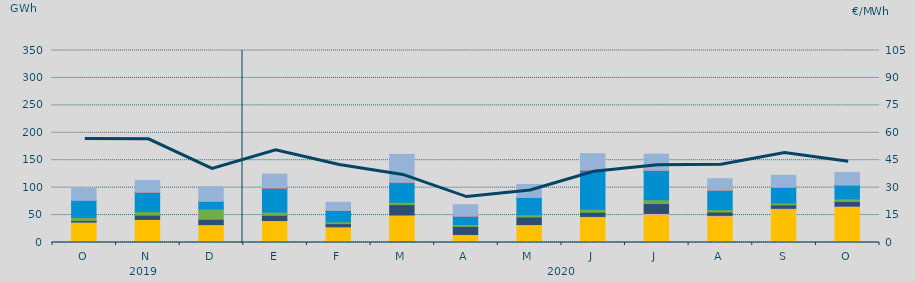
| Category | Carbón | Ciclo Combinado | Cogeneración | Consumo Bombeo | Eólica | Hidráulica | Nuclear | Otras Renovables | Solar fotovoltaica | Solar térmica | Turbinación bombeo |
|---|---|---|---|---|---|---|---|---|---|---|---|
| O | 1718.2 | 35506.1 | 18 | 2744.7 | 5556.7 | 31702.3 | 0 | 0.8 | 0 | 0 | 21165.2 |
| N | 1857.3 | 40203.9 | 0 | 7774.6 | 6415.7 | 35320.4 | 90 | 0 | 4.8 | 0 | 21237.9 |
| D | 554 | 31978.8 | 44.6 | 9751.3 | 18898.5 | 13540.8 | 366.6 | 0 | 2.1 | 0 | 26259.7 |
| E | 1376.4 | 38547.2 | 103.6 | 9542.6 | 5736.2 | 43797.8 | 0.3 | 0 | 1.3 | 1 | 25589.5 |
| F | 1350.5 | 27202.4 | 33.6 | 5812.5 | 3281.1 | 20532.5 | 140 | 103.7 | 7.4 | 0 | 14830 |
| M | 2245.9 | 47824.7 | 73.5 | 18946.1 | 4359.7 | 35788.8 | 0 | 674.6 | 8.2 | 0 | 50742.6 |
| A | 0 | 14386.3 | 255.3 | 14671.4 | 3599.9 | 14970.4 | 0 | 474.6 | 1.7 | 0 | 20437.2 |
| M | 0 | 31710.8 | 991.1 | 13782.9 | 4057.5 | 31461.1 | 16.4 | 257 | 5.9 | 0 | 23468.1 |
| J | 82.3 | 46358.8 | 1092.1 | 7553.9 | 5342.6 | 71363.3 | 488.9 | 0.6 | 15.1 | 0 | 29619.5 |
| J | 41 | 51366.4 | 1567 | 17926.2 | 6971.2 | 53578.6 | 144 | 24.9 | 30.8 | 0 | 29400.3 |
| A | 6.7 | 48088.1 | 1369.2 | 5986.6 | 4572.9 | 35455.6 | 0 | 107.3 | 13.8 | 0 | 20673.5 |
| S | 54.7 | 60777.7 | 1507.9 | 6085.9 | 3725.9 | 28681.9 | 75 | 8 | 25.7 | 0 | 21527.4 |
| O | 27.3 | 65427.4 | 840.9 | 8534.6 | 4755.7 | 24804.7 | 0 | 0 | 8 | 2.5 | 23457.4 |